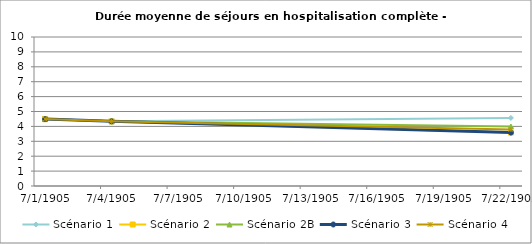
| Category | Scénario 1 | Scénario 2 | Scénario 2B | Scénario 3 | Scénario 4 |
|---|---|---|---|---|---|
| 2009.0 | 4.49 | 4.49 | 4.49 | 4.49 | 4.49 |
| 2012.0 | 4.34 | 4.34 | 4.34 | 4.34 | 4.34 |
| 2030.0 | 4.569 | 3.586 | 3.991 | 3.586 | 3.795 |